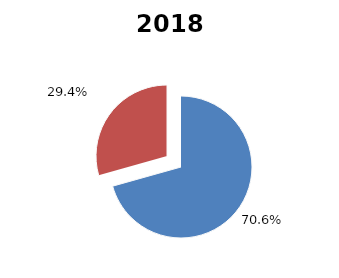
| Category | 2018 |
|---|---|
| Recaudación gestión directa | 2460658.042 |
| Ajustes fiscales | 1022295.548 |